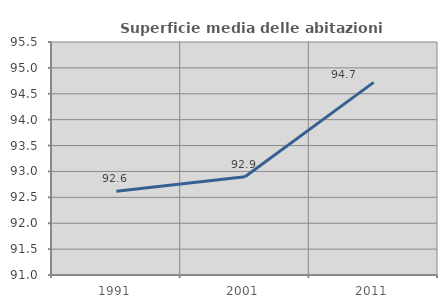
| Category | Superficie media delle abitazioni occupate |
|---|---|
| 1991.0 | 92.616 |
| 2001.0 | 92.897 |
| 2011.0 | 94.719 |